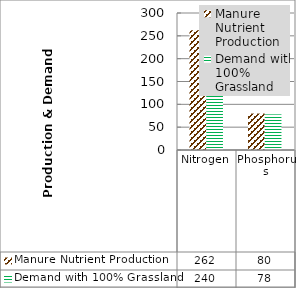
| Category | Manure Nutrient Production | Demand with 100% Grassland |
|---|---|---|
| Nitrogen | 262.418 | 240 |
| Phosphorus | 79.761 | 78 |